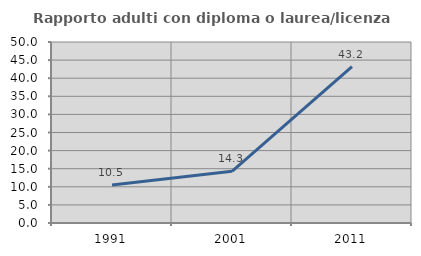
| Category | Rapporto adulti con diploma o laurea/licenza media  |
|---|---|
| 1991.0 | 10.526 |
| 2001.0 | 14.286 |
| 2011.0 | 43.182 |